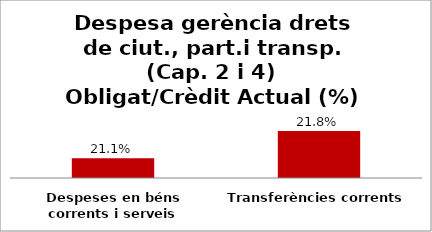
| Category | Series 0 |
|---|---|
| Despeses en béns corrents i serveis | 0.211 |
| Transferències corrents | 0.218 |